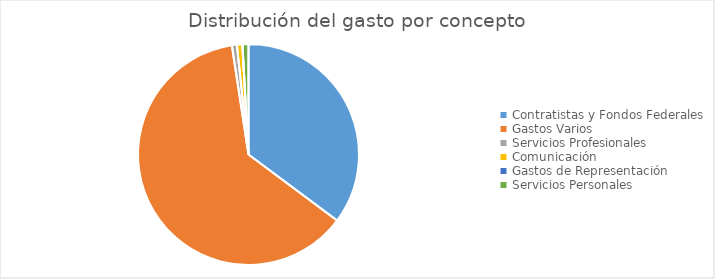
| Category | Series 0 |
|---|---|
| Contratistas y Fondos Federales | 265908831.45 |
| Gastos Varios | 471579552.62 |
| Servicios Profesionales | 5482407.53 |
| Comunicación | 5975034.27 |
| Gastos de Representación | 106250 |
| Servicios Personales | 6652060.52 |